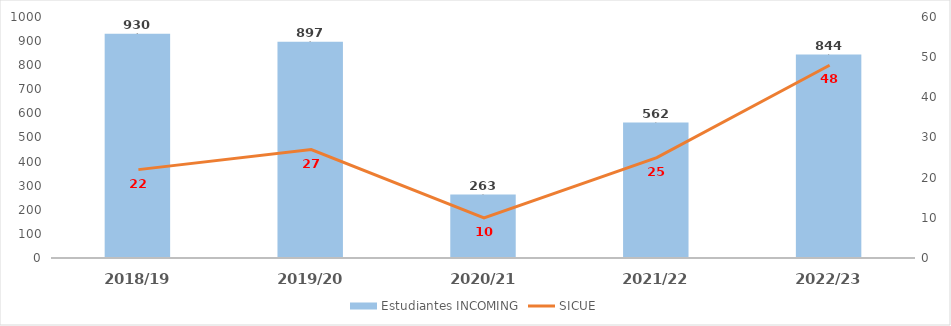
| Category | Estudiantes INCOMING |
|---|---|
| 2018/19 | 930 |
| 2019/20 | 897 |
| 2020/21 | 263 |
| 2021/22 | 562 |
| 2022/23 | 844 |